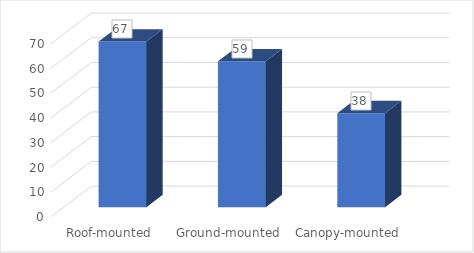
| Category | Series 0 |
|---|---|
| Roof-mounted | 67 |
| Ground-mounted | 59 |
| Canopy-mounted | 38 |